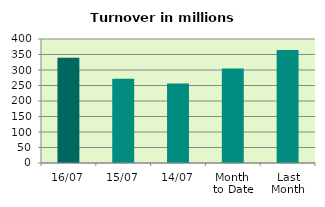
| Category | Series 0 |
|---|---|
| 16/07 | 339.348 |
| 15/07 | 271.78 |
| 14/07 | 256.262 |
| Month 
to Date | 304.969 |
| Last
Month | 364.182 |